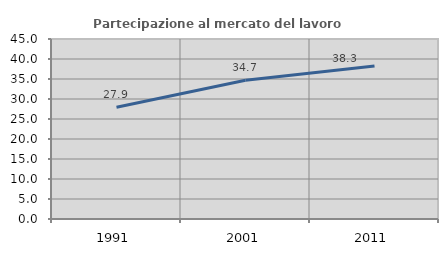
| Category | Partecipazione al mercato del lavoro  femminile |
|---|---|
| 1991.0 | 27.94 |
| 2001.0 | 34.67 |
| 2011.0 | 38.254 |